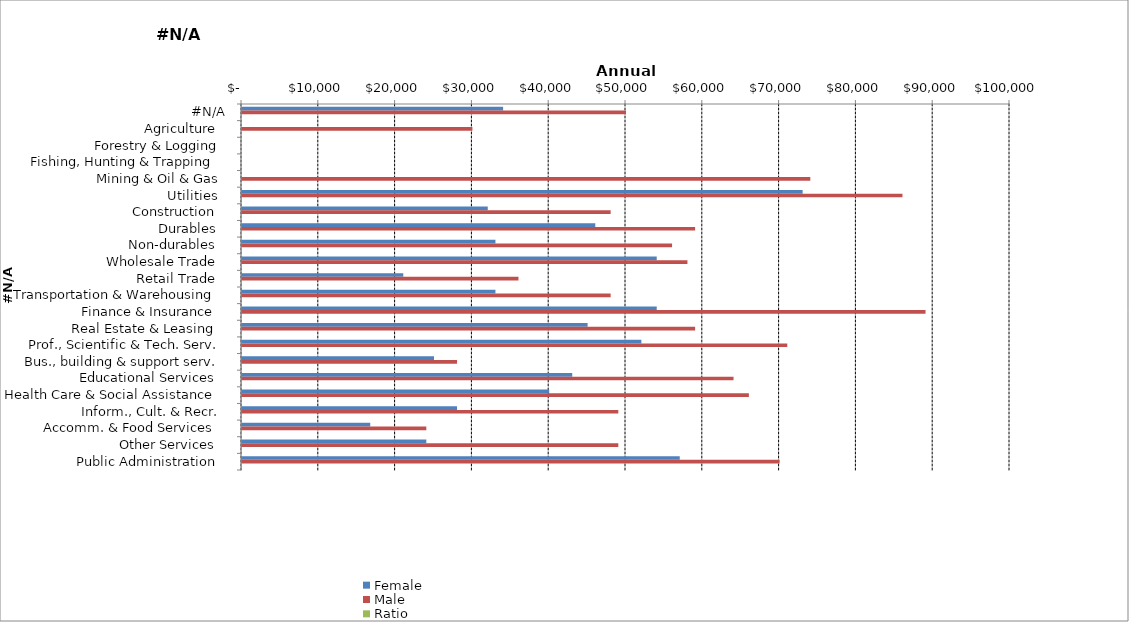
| Category | Female | Male | Ratio |
|---|---|---|---|
|  #N/A  | 34000 | 50000 | 0.68 |
|  Agriculture   | 0 | 30000 | 0 |
|  Forestry & Logging  | 0 | 0 | 0 |
|  Fishing, Hunting & Trapping   | 0 | 0 | 0 |
|  Mining & Oil & Gas  | 0 | 74000 | 0 |
|  Utilities   | 73000 | 86000 | 0.849 |
|  Construction   | 32000 | 48000 | 0.667 |
|  Durables   | 46000 | 59000 | 0.78 |
|  Non-durables   | 33000 | 56000 | 0.589 |
|  Wholesale Trade   | 54000 | 58000 | 0.931 |
|  Retail Trade   | 21000 | 36000 | 0.583 |
|  Transportation & Warehousing   | 33000 | 48000 | 0.688 |
|  Finance & Insurance   | 54000 | 89000 | 0.607 |
|  Real Estate & Leasing   | 45000 | 59000 | 0.763 |
|  Prof., Scientific & Tech. Serv.  | 52000 | 71000 | 0.732 |
|  Bus., building & support serv.  | 25000 | 28000 | 0.893 |
|  Educational Services   | 43000 | 64000 | 0.672 |
|  Health Care & Social Assistance   | 40000 | 66000 | 0.606 |
|  Inform., Cult. & Recr.  | 28000 | 49000 | 0.571 |
|  Accomm. & Food Services   | 16700 | 24000 | 0.696 |
|  Other Services   | 24000 | 49000 | 0.49 |
|  Public Administration   | 57000 | 70000 | 0.814 |